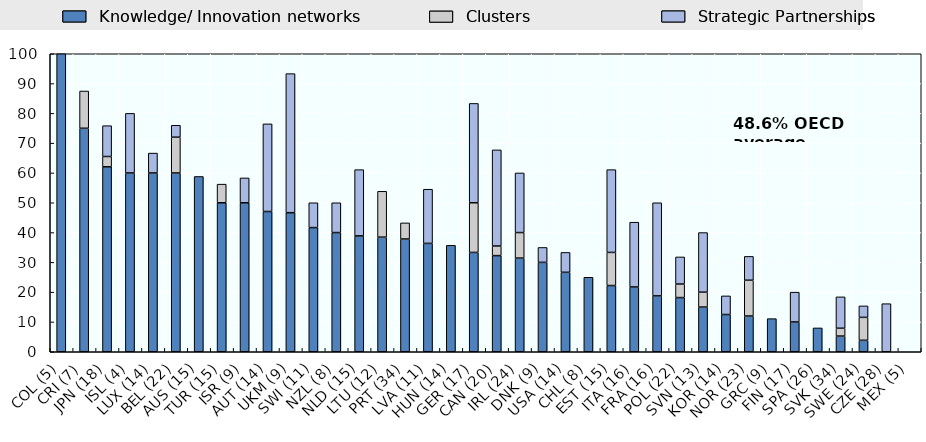
| Category | Knowledge/ Innovation networks | Clusters | Strategic Partnerships |
|---|---|---|---|
| COL (5) | 100 | 0 | 0 |
| CRI (7) | 75 | 12.5 | 0 |
| JPN (18) | 62.069 | 3.448 | 10.345 |
| ISL (4) | 60 | 0 | 20 |
| LUX (14) | 60 | 0 | 6.667 |
| BEL (22) | 60 | 12 | 4 |
| AUS (15) | 58.824 | 0 | 0 |
| TUR (15) | 50 | 6.25 | 0 |
| ISR (9) | 50 | 0 | 8.333 |
| AUT (14) | 47.059 | 0 | 29.412 |
| UKM (9) | 46.667 | 0 | 46.667 |
| SWI (11) | 41.667 | 0 | 8.333 |
| NZL (8) | 40 | 0 | 10 |
| NLD (15) | 38.889 | 0 | 22.222 |
| LTU (12) | 38.462 | 15.385 | 0 |
| PRT (34) | 37.838 | 5.405 | 0 |
| LVA (11) | 36.364 | 0 | 18.182 |
| HUN (14) | 35.714 | 0 | 0 |
| GER (17) | 33.333 | 16.667 | 33.333 |
| CAN (20) | 32.258 | 3.226 | 32.258 |
| IRL (24) | 31.429 | 8.571 | 20 |
| DNK (9) | 30 | 0 | 5 |
| USA (14) | 26.667 | 0 | 6.667 |
| CHL (8) | 25 | 0 | 0 |
| EST (15) | 22.222 | 11.111 | 27.778 |
| ITA (16) | 21.739 | 0 | 21.739 |
| FRA (16) | 18.75 | 0 | 31.25 |
| POL (22) | 18.182 | 4.545 | 9.091 |
| SVN (13) | 15 | 5 | 20 |
| KOR (14) | 12.5 | 0 | 6.25 |
| NOR (23) | 12 | 12 | 8 |
| GRC (9) | 11.111 | 0 | 0 |
| FIN (17) | 10 | 0 | 10 |
| SPA (26) | 8 | 0 | 0 |
| SVK (34) | 5.263 | 2.632 | 10.526 |
| SWE (24) | 3.846 | 7.692 | 3.846 |
| CZE (28) | 0 | 0 | 16.129 |
| MEX (5) | 0 | 0 | 0 |